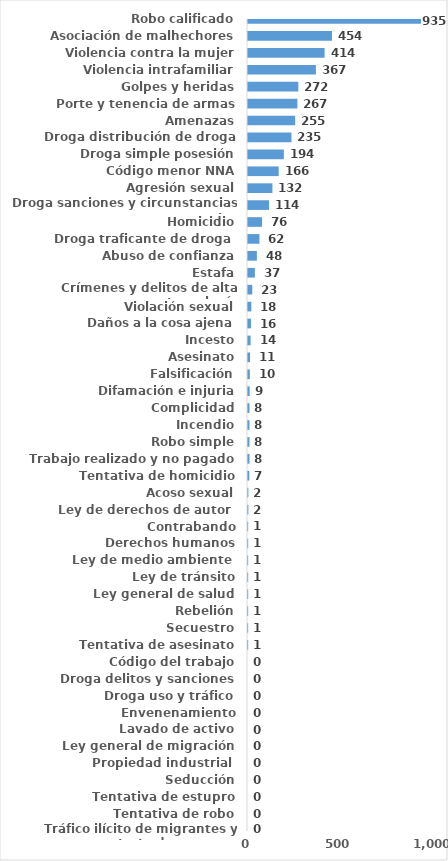
| Category | Series 0 |
|---|---|
| Robo calificado | 935 |
| Asociación de malhechores | 454 |
| Violencia contra la mujer | 414 |
| Violencia intrafamiliar | 367 |
| Golpes y heridas | 272 |
| Porte y tenencia de armas | 267 |
| Amenazas | 255 |
| Droga distribución de droga | 235 |
| Droga simple posesión | 194 |
| Código menor NNA | 166 |
| Agresión sexual | 132 |
| Droga sanciones y circunstancias agravantes | 114 |
| Homicidio | 76 |
| Droga traficante de droga  | 62 |
| Abuso de confianza | 48 |
| Estafa | 37 |
| Crímenes y delitos de alta tecnología | 23 |
| Violación sexual | 18 |
| Daños a la cosa ajena | 16 |
| Incesto | 14 |
| Asesinato | 11 |
| Falsificación | 10 |
| Difamación e injuria | 9 |
| Complicidad | 8 |
| Incendio | 8 |
| Robo simple | 8 |
| Trabajo realizado y no pagado | 8 |
| Tentativa de homicidio | 7 |
| Acoso sexual | 2 |
| Ley de derechos de autor  | 2 |
| Contrabando | 1 |
| Derechos humanos | 1 |
| Ley de medio ambiente  | 1 |
| Ley de tránsito | 1 |
| Ley general de salud | 1 |
| Rebelión | 1 |
| Secuestro | 1 |
| Tentativa de asesinato | 1 |
| Código del trabajo | 0 |
| Droga delitos y sanciones | 0 |
| Droga uso y tráfico | 0 |
| Envenenamiento | 0 |
| Lavado de activo | 0 |
| Ley general de migración | 0 |
| Propiedad industrial  | 0 |
| Seducción | 0 |
| Tentativa de estupro | 0 |
| Tentativa de robo | 0 |
| Tráfico ilícito de migrantes y trata de personas | 0 |